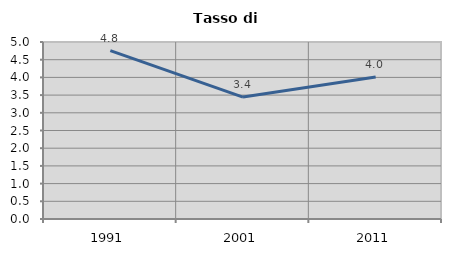
| Category | Tasso di disoccupazione   |
|---|---|
| 1991.0 | 4.756 |
| 2001.0 | 3.444 |
| 2011.0 | 4.011 |